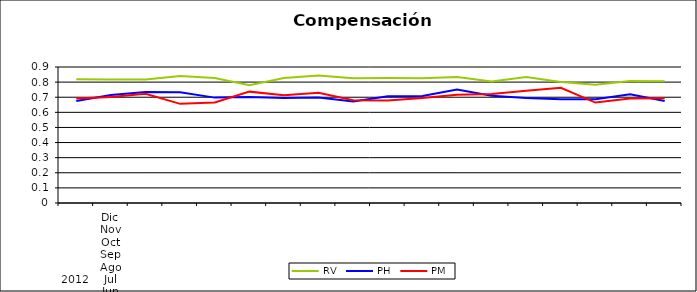
| Category | RV | PH | PM |
|---|---|---|---|
| 0 | 0.819 | 0.675 | 0.691 |
| 1 | 0.818 | 0.714 | 0.701 |
| 2 | 0.817 | 0.734 | 0.722 |
| 3 | 0.84 | 0.732 | 0.656 |
| 4 | 0.827 | 0.697 | 0.666 |
| 5 | 0.78 | 0.701 | 0.737 |
| 6 | 0.827 | 0.695 | 0.713 |
| 7 | 0.844 | 0.699 | 0.73 |
| 8 | 0.826 | 0.672 | 0.68 |
| 9 | 0.827 | 0.706 | 0.678 |
| 10 | 0.826 | 0.709 | 0.696 |
| 11 | 0.834 | 0.751 | 0.717 |
| 12 | 0.804 | 0.709 | 0.721 |
| 13 | 0.834 | 0.694 | 0.743 |
| 14 | 0.802 | 0.687 | 0.763 |
| 15 | 0.783 | 0.687 | 0.665 |
| 16 | 0.807 | 0.72 | 0.692 |
| 17 | 0.805 | 0.674 | 0.693 |